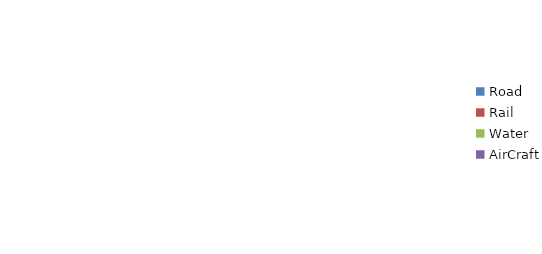
| Category | Series 0 |
|---|---|
| Road | 0 |
| Rail | 0 |
| Water | 0 |
| AirCraft | 0 |